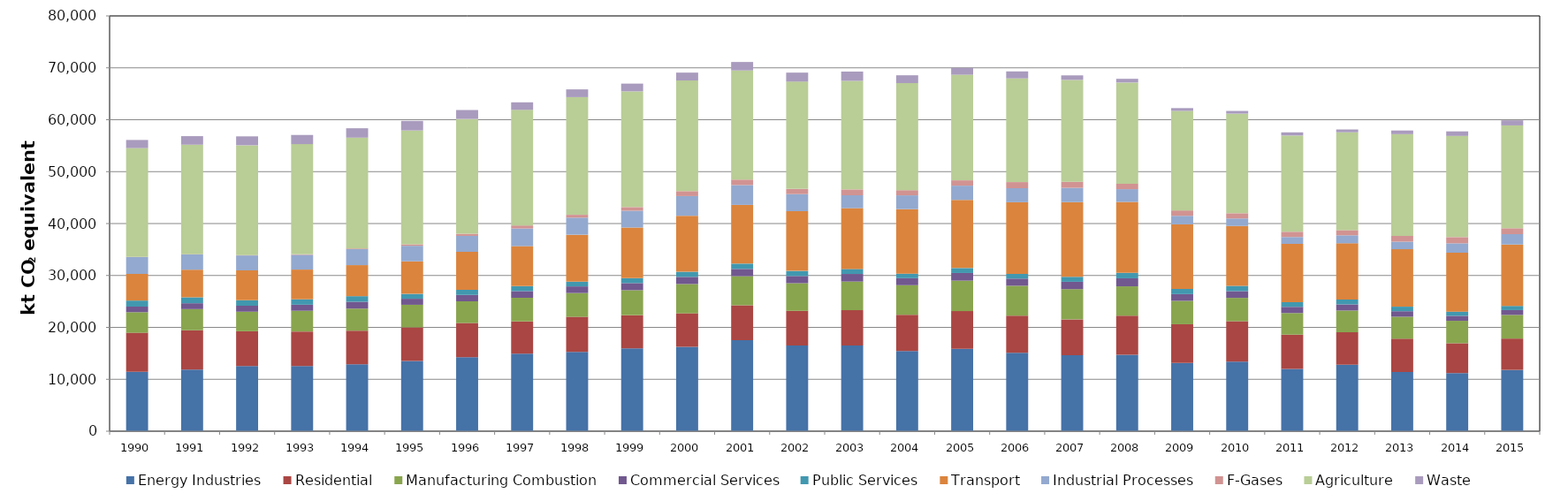
| Category | Energy Industries | Residential | Manufacturing Combustion | Commercial Services | Public Services | Transport | Industrial Processes | F-Gases | Agriculture | Waste |
|---|---|---|---|---|---|---|---|---|---|---|
| 1990.0 | 11434.977 | 7523.665 | 3961.75 | 1083.488 | 1160.655 | 5135.478 | 3236.942 | 35.233 | 20963.287 | 1567.294 |
| 1991.0 | 11881.026 | 7565.932 | 4074.455 | 1129.638 | 1144.579 | 5314.705 | 2935.421 | 50.144 | 21094.093 | 1648.194 |
| 1992.0 | 12532.839 | 6717.802 | 3768.741 | 1153.535 | 1062.542 | 5744.794 | 2871.831 | 65.129 | 21164.548 | 1713.638 |
| 1993.0 | 12544.332 | 6667.011 | 3986.719 | 1168.71 | 1046.876 | 5721.605 | 2837.363 | 95.61 | 21235.843 | 1763.235 |
| 1994.0 | 12874.914 | 6496.577 | 4242.626 | 1321.249 | 1079.278 | 5974.943 | 3075.496 | 131.519 | 21353.561 | 1807.022 |
| 1995.0 | 13553.171 | 6452.047 | 4347.623 | 1165.567 | 936.341 | 6271.711 | 2989.357 | 284.286 | 21929.502 | 1842.961 |
| 1996.0 | 14266.495 | 6576.348 | 4182.735 | 1224.716 | 979.841 | 7321.986 | 3071.363 | 406.536 | 22116.694 | 1722.255 |
| 1997.0 | 14917.136 | 6235.915 | 4550.551 | 1285.306 | 955.367 | 7702.13 | 3400.614 | 585.097 | 22271.888 | 1449.389 |
| 1998.0 | 15280.542 | 6744.746 | 4589.618 | 1279.143 | 906.143 | 9048.156 | 3289.829 | 546.432 | 22670.856 | 1493.299 |
| 1999.0 | 15973.011 | 6377.877 | 4810.475 | 1368.199 | 954.753 | 9749.217 | 3238.568 | 699.204 | 22288.085 | 1499.347 |
| 2000.0 | 16245.03 | 6462.603 | 5642.369 | 1374.708 | 989.427 | 10788.975 | 3787.401 | 955.351 | 21318.164 | 1511.634 |
| 2001.0 | 17526.091 | 6732.292 | 5599.385 | 1402.546 | 1019.458 | 11311.989 | 3820.258 | 1055.448 | 21031.58 | 1625.12 |
| 2002.0 | 16528.287 | 6658.625 | 5323.055 | 1382.59 | 981.607 | 11506.561 | 3294.61 | 985.322 | 20683.628 | 1731.304 |
| 2003.0 | 16496.755 | 6812.58 | 5513.819 | 1468.773 | 963.298 | 11709.932 | 2483.869 | 1127.658 | 20912.683 | 1787.18 |
| 2004.0 | 15438.487 | 6992.507 | 5694.093 | 1349.259 | 871.419 | 12430.284 | 2655.599 | 1000.233 | 20622.417 | 1508.266 |
| 2005.0 | 15858.056 | 7271.948 | 5870.713 | 1475.692 | 952.53 | 13121.297 | 2749.047 | 1019.956 | 20347.333 | 1315.055 |
| 2006.0 | 15103.65 | 7157.483 | 5752.699 | 1380.083 | 912.743 | 13801.502 | 2697.071 | 1178.188 | 19976.658 | 1351.141 |
| 2007.0 | 14624.578 | 6928.528 | 5811.69 | 1414.816 | 958.755 | 14388.105 | 2752.755 | 1174.618 | 19618.163 | 873.639 |
| 2008.0 | 14730.238 | 7521.571 | 5654.192 | 1547.672 | 1052.754 | 13660.614 | 2458.773 | 1036.59 | 19507.468 | 712.914 |
| 2009.0 | 13135.538 | 7467.042 | 4505.244 | 1297.823 | 1001.792 | 12441.374 | 1640.313 | 1037.897 | 19172.154 | 540.776 |
| 2010.0 | 13385.813 | 7800.947 | 4497.089 | 1296.572 | 1021.031 | 11528.462 | 1446.795 | 1011.695 | 19178.903 | 524.59 |
| 2011.0 | 11989.193 | 6609.753 | 4159.664 | 1194.975 | 913.568 | 11219.542 | 1315.903 | 1016.492 | 18533.138 | 615.217 |
| 2012.0 | 12823.8 | 6232.386 | 4188.594 | 1184.394 | 930.816 | 10835.821 | 1539.223 | 996.334 | 18852.703 | 539.967 |
| 2013.0 | 11413.94 | 6395.356 | 4238.565 | 1066.171 | 871.093 | 11065.556 | 1453.956 | 1122.772 | 19598.228 | 696.837 |
| 2014.0 | 11197.245 | 5745.611 | 4323.401 | 956.975 | 815.506 | 11347.382 | 1807.429 | 1194.488 | 19491.068 | 878.81 |
| 2015.0 | 11803.218 | 6041.359 | 4548.821 | 934.768 | 806.023 | 11827.35 | 1992.568 | 1142.746 | 19807.194 | 974.165 |